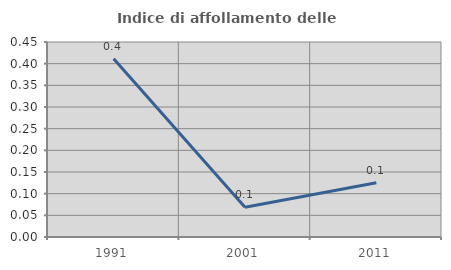
| Category | Indice di affollamento delle abitazioni  |
|---|---|
| 1991.0 | 0.411 |
| 2001.0 | 0.069 |
| 2011.0 | 0.125 |